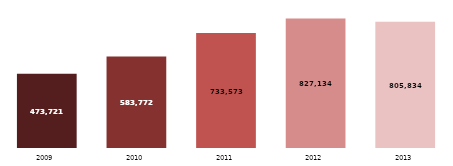
| Category | CIMENTO ( t ) |
|---|---|
| 2009.0 | 473721 |
| 2010.0 | 583772 |
| 2011.0 | 733573 |
| 2012.0 | 827134 |
| 2013.0 | 805834 |